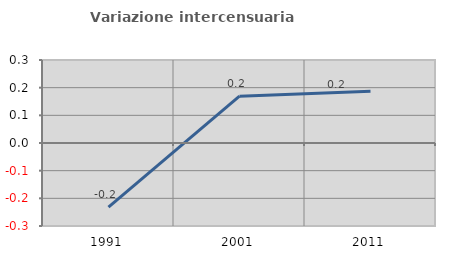
| Category | Variazione intercensuaria annua |
|---|---|
| 1991.0 | -0.231 |
| 2001.0 | 0.169 |
| 2011.0 | 0.187 |